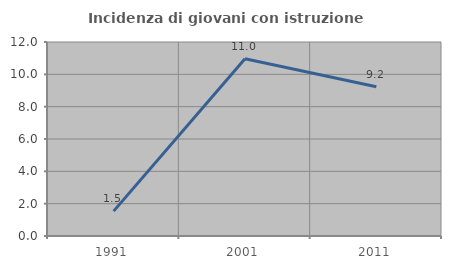
| Category | Incidenza di giovani con istruzione universitaria |
|---|---|
| 1991.0 | 1.538 |
| 2001.0 | 10.959 |
| 2011.0 | 9.231 |